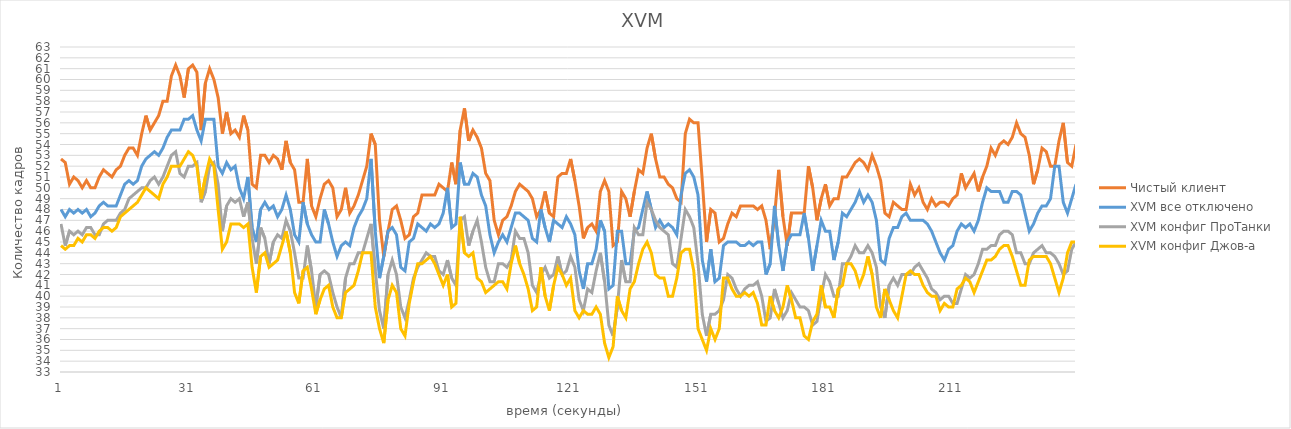
| Category | Чистый клиент | XVM все отключено | XVM конфиг ПроТанки | XVM конфиг Джов-а |
|---|---|---|---|---|
| 0 | 52.667 | 48 | 46.667 | 44.667 |
| 1 | 52.333 | 47.333 | 44.667 | 44.333 |
| 2 | 50.333 | 48 | 46 | 44.667 |
| 3 | 51 | 47.667 | 45.667 | 44.667 |
| 4 | 50.667 | 48 | 46 | 45.333 |
| 5 | 50 | 47.667 | 45.667 | 45 |
| 6 | 50.667 | 48 | 46.333 | 45.667 |
| 7 | 50 | 47.333 | 46.333 | 45.667 |
| 8 | 50 | 47.667 | 45.667 | 45.333 |
| 9 | 51 | 48.333 | 45.667 | 46 |
| 10 | 51.667 | 48.667 | 46.667 | 46.333 |
| 11 | 51.333 | 48.333 | 47 | 46.333 |
| 12 | 51 | 48.333 | 47 | 46 |
| 13 | 51.667 | 48.333 | 47 | 46.333 |
| 14 | 52 | 49.333 | 47.667 | 47.333 |
| 15 | 53 | 50.333 | 48 | 47.667 |
| 16 | 53.667 | 50.667 | 49 | 48 |
| 17 | 53.667 | 50.333 | 49.333 | 48.333 |
| 18 | 53 | 50.667 | 49.667 | 48.667 |
| 19 | 55 | 52 | 50 | 49.333 |
| 20 | 56.667 | 52.667 | 50 | 50 |
| 21 | 55.333 | 53 | 50.667 | 49.667 |
| 22 | 56 | 53.333 | 51 | 49.333 |
| 23 | 56.667 | 53 | 50.333 | 49 |
| 24 | 58 | 53.667 | 51 | 50.333 |
| 25 | 58 | 54.667 | 52 | 51 |
| 26 | 60.333 | 55.333 | 53 | 52 |
| 27 | 61.333 | 55.333 | 53.333 | 52 |
| 28 | 60.333 | 55.333 | 51.333 | 52 |
| 29 | 58.333 | 56.333 | 51 | 52.667 |
| 30 | 61 | 56.333 | 52 | 53.333 |
| 31 | 61.333 | 56.667 | 52 | 53 |
| 32 | 60.667 | 55.333 | 52.333 | 52 |
| 33 | 55.333 | 54.333 | 48.667 | 49 |
| 34 | 59.667 | 56.333 | 49.667 | 51 |
| 35 | 61 | 56.333 | 52 | 52.667 |
| 36 | 60 | 56.333 | 52.333 | 52 |
| 37 | 58.333 | 52 | 50.333 | 48 |
| 38 | 55 | 51.333 | 46 | 44.333 |
| 39 | 57 | 52.333 | 48.333 | 45 |
| 40 | 55 | 51.667 | 49 | 46.667 |
| 41 | 55.333 | 52 | 48.667 | 46.667 |
| 42 | 54.667 | 50 | 49 | 46.667 |
| 43 | 56.667 | 49 | 47.333 | 46.333 |
| 44 | 55.333 | 51 | 48.667 | 46.667 |
| 45 | 50.333 | 46.333 | 45.333 | 42.667 |
| 46 | 50 | 45 | 43 | 40.333 |
| 47 | 53 | 48 | 46.333 | 43.667 |
| 48 | 53 | 48.667 | 45.333 | 44 |
| 49 | 52.333 | 48 | 43 | 42.667 |
| 50 | 53 | 48.333 | 45 | 43 |
| 51 | 52.667 | 47.333 | 45.667 | 43.333 |
| 52 | 51.667 | 48 | 45.333 | 44.667 |
| 53 | 54.333 | 49.333 | 47 | 46 |
| 54 | 52.333 | 48 | 46 | 44 |
| 55 | 51.667 | 45.667 | 44 | 40.333 |
| 56 | 48.667 | 45 | 41.667 | 39.333 |
| 57 | 48.667 | 48.667 | 41.667 | 42.333 |
| 58 | 52.667 | 46.667 | 44.667 | 42.667 |
| 59 | 48.333 | 45.667 | 42.333 | 40.667 |
| 60 | 47.333 | 45 | 39 | 38.333 |
| 61 | 49 | 45 | 42 | 39.667 |
| 62 | 50.333 | 48 | 42.333 | 40.667 |
| 63 | 50.667 | 46.667 | 42 | 41 |
| 64 | 50 | 45 | 40.333 | 39 |
| 65 | 47.333 | 43.667 | 39 | 38 |
| 66 | 48 | 44.667 | 38 | 38 |
| 67 | 50 | 45 | 41.667 | 40.333 |
| 68 | 47.667 | 44.667 | 43 | 40.667 |
| 69 | 48.333 | 46.333 | 43 | 41 |
| 70 | 49.333 | 47.333 | 44 | 42.333 |
| 71 | 50.667 | 48 | 44 | 44 |
| 72 | 52 | 49 | 45.333 | 44 |
| 73 | 55 | 52.667 | 46.667 | 44 |
| 74 | 54 | 46 | 42.333 | 39 |
| 75 | 47 | 41.667 | 38.667 | 37 |
| 76 | 43.667 | 43.667 | 37 | 35.667 |
| 77 | 46 | 46 | 42 | 39.667 |
| 78 | 48 | 46.333 | 43.333 | 41 |
| 79 | 48.333 | 45.667 | 42 | 40.333 |
| 80 | 47 | 42.667 | 39 | 37 |
| 81 | 45.333 | 42.333 | 38 | 36.333 |
| 82 | 45.667 | 45 | 39.667 | 39.333 |
| 83 | 47.333 | 45.333 | 41.667 | 41.333 |
| 84 | 47.667 | 46.667 | 42.667 | 43 |
| 85 | 49.333 | 46.333 | 43.333 | 43 |
| 86 | 49.333 | 46 | 44 | 43.333 |
| 87 | 49.333 | 46.667 | 43.667 | 43.667 |
| 88 | 49.333 | 46.333 | 43.667 | 43 |
| 89 | 50.333 | 46.667 | 42.333 | 42 |
| 90 | 50 | 47.667 | 42 | 41 |
| 91 | 49.667 | 50 | 43.333 | 42 |
| 92 | 52.333 | 46.333 | 41.667 | 39 |
| 93 | 50.333 | 46.667 | 41 | 39.333 |
| 94 | 55.333 | 52.333 | 47 | 47.333 |
| 95 | 57.333 | 50.333 | 47.333 | 44 |
| 96 | 54.333 | 50.333 | 44.667 | 43.667 |
| 97 | 55.333 | 51.333 | 46 | 44 |
| 98 | 54.667 | 51 | 47 | 41.667 |
| 99 | 53.667 | 49.333 | 45 | 41.333 |
| 100 | 51.333 | 48.333 | 42.667 | 40.333 |
| 101 | 50.667 | 45.667 | 41.333 | 40.667 |
| 102 | 47 | 44 | 41.333 | 41 |
| 103 | 45.667 | 45 | 43 | 41.333 |
| 104 | 47 | 45.667 | 43 | 41.333 |
| 105 | 47.333 | 45 | 42.667 | 40.667 |
| 106 | 48.333 | 46.333 | 43.333 | 43 |
| 107 | 49.667 | 47.667 | 46 | 44.667 |
| 108 | 50.333 | 47.667 | 45.333 | 43 |
| 109 | 50 | 47.333 | 45.333 | 42 |
| 110 | 49.667 | 47 | 44 | 40.667 |
| 111 | 49 | 45.333 | 41 | 38.667 |
| 112 | 47.333 | 45 | 40.333 | 39 |
| 113 | 48 | 48 | 42 | 42.667 |
| 114 | 49.667 | 46.333 | 42.667 | 40 |
| 115 | 47.667 | 45 | 41.667 | 38.667 |
| 116 | 47.333 | 47 | 42 | 41 |
| 117 | 51 | 46.667 | 43.667 | 42.667 |
| 118 | 51.333 | 46.333 | 42 | 42 |
| 119 | 51.333 | 47.333 | 42.333 | 41 |
| 120 | 52.667 | 46.667 | 43.667 | 41.667 |
| 121 | 50.667 | 45.667 | 42.667 | 38.667 |
| 122 | 48.333 | 42.333 | 39.667 | 38 |
| 123 | 45.333 | 40.667 | 38.667 | 38.667 |
| 124 | 46.333 | 43 | 40.667 | 38.333 |
| 125 | 46.667 | 43 | 40.333 | 38.333 |
| 126 | 46 | 44.333 | 42.333 | 39 |
| 127 | 49.667 | 47 | 44 | 38.333 |
| 128 | 50.667 | 46 | 41.333 | 35.667 |
| 129 | 49.667 | 40.667 | 37.333 | 34.333 |
| 130 | 44.667 | 41 | 36.333 | 35.333 |
| 131 | 45 | 46 | 39 | 40 |
| 132 | 49.667 | 46 | 43.333 | 38.667 |
| 133 | 49 | 43 | 41.333 | 38 |
| 134 | 47.333 | 43 | 41.333 | 40.667 |
| 135 | 49.667 | 46 | 46.333 | 41.333 |
| 136 | 51.667 | 46.333 | 45.667 | 43 |
| 137 | 51.333 | 48 | 45.667 | 44.333 |
| 138 | 53.667 | 49.667 | 48.667 | 45 |
| 139 | 55 | 48 | 48 | 44 |
| 140 | 52.667 | 46.333 | 47 | 42 |
| 141 | 51 | 47 | 46.333 | 41.667 |
| 142 | 51 | 46.333 | 46 | 41.667 |
| 143 | 50.333 | 46.667 | 45.667 | 40 |
| 144 | 50 | 46.333 | 43 | 40 |
| 145 | 49 | 45.667 | 42.667 | 41.667 |
| 146 | 48.667 | 49.333 | 45.333 | 44 |
| 147 | 55 | 51.333 | 48 | 44.333 |
| 148 | 56.333 | 51.667 | 47.333 | 44.333 |
| 149 | 56 | 51 | 46.333 | 42.333 |
| 150 | 56 | 49.333 | 43 | 37 |
| 151 | 50.667 | 43.333 | 38.333 | 36 |
| 152 | 45 | 41.333 | 36.333 | 35 |
| 153 | 48 | 44.333 | 38.333 | 37 |
| 154 | 47.667 | 41.333 | 38.333 | 36 |
| 155 | 45 | 41.667 | 38.667 | 37 |
| 156 | 45.333 | 44.667 | 39.667 | 41.667 |
| 157 | 46.667 | 45 | 42 | 41.667 |
| 158 | 47.667 | 45 | 41.667 | 40.667 |
| 159 | 47.333 | 45 | 40.667 | 40 |
| 160 | 48.333 | 44.667 | 40 | 40 |
| 161 | 48.333 | 44.667 | 40.667 | 40.333 |
| 162 | 48.333 | 45 | 41 | 40 |
| 163 | 48.333 | 44.667 | 41 | 40.333 |
| 164 | 48 | 45 | 41.333 | 39.333 |
| 165 | 48.333 | 45 | 40 | 37.333 |
| 166 | 47 | 42 | 37.667 | 37.333 |
| 167 | 44.333 | 43 | 38 | 40 |
| 168 | 47.333 | 48.333 | 40.667 | 38.667 |
| 169 | 51.667 | 44.667 | 39.333 | 38 |
| 170 | 47.333 | 42.333 | 38 | 39 |
| 171 | 44.667 | 45 | 38.667 | 41 |
| 172 | 47.667 | 45.667 | 40.333 | 39.667 |
| 173 | 47.667 | 45.667 | 39.667 | 38 |
| 174 | 47.667 | 45.667 | 39 | 38 |
| 175 | 47.667 | 47.667 | 39 | 36.333 |
| 176 | 52 | 45.333 | 38.667 | 36 |
| 177 | 50 | 42.333 | 37.333 | 37.667 |
| 178 | 47 | 44.667 | 37.667 | 38.333 |
| 179 | 49 | 47 | 40 | 41 |
| 180 | 50.333 | 46 | 42 | 39 |
| 181 | 48.333 | 46 | 41.333 | 39 |
| 182 | 49 | 43.333 | 40 | 38 |
| 183 | 49 | 45 | 40 | 40.667 |
| 184 | 51 | 47.667 | 43 | 41 |
| 185 | 51 | 47.333 | 43 | 43 |
| 186 | 51.667 | 48 | 43.667 | 43 |
| 187 | 52.333 | 48.667 | 44.667 | 42.333 |
| 188 | 52.667 | 49.667 | 44 | 41 |
| 189 | 52.333 | 48.667 | 44 | 42 |
| 190 | 51.667 | 49.333 | 44.667 | 43.667 |
| 191 | 53 | 48.667 | 44 | 42 |
| 192 | 52 | 47 | 42.667 | 39 |
| 193 | 50.667 | 43.333 | 39 | 38 |
| 194 | 47.667 | 43 | 38 | 40.667 |
| 195 | 47.333 | 45.333 | 41 | 39.667 |
| 196 | 48.667 | 46.333 | 41.667 | 38.667 |
| 197 | 48.333 | 46.333 | 41 | 38 |
| 198 | 48 | 47.333 | 42 | 40 |
| 199 | 48 | 47.667 | 42 | 42 |
| 200 | 50.333 | 47 | 42 | 42.333 |
| 201 | 49.333 | 47 | 42.667 | 42 |
| 202 | 50 | 47 | 43 | 42 |
| 203 | 48.667 | 47 | 42.333 | 41 |
| 204 | 48 | 46.667 | 41.667 | 40.333 |
| 205 | 49 | 46 | 40.667 | 40 |
| 206 | 48.333 | 45 | 40.333 | 40 |
| 207 | 48.667 | 44 | 39.667 | 38.667 |
| 208 | 48.667 | 43.333 | 40 | 39.333 |
| 209 | 48.333 | 44.333 | 40 | 39 |
| 210 | 49 | 44.667 | 39.333 | 39 |
| 211 | 49.333 | 46 | 39.333 | 40.667 |
| 212 | 51.333 | 46.667 | 40.667 | 41 |
| 213 | 50 | 46.333 | 42 | 41.667 |
| 214 | 50.667 | 46.667 | 41.667 | 41.333 |
| 215 | 51.333 | 46 | 42 | 40.333 |
| 216 | 49.667 | 47 | 43 | 41.333 |
| 217 | 51 | 48.667 | 44.333 | 42.333 |
| 218 | 52 | 50 | 44.333 | 43.333 |
| 219 | 53.667 | 49.667 | 44.667 | 43.333 |
| 220 | 53 | 49.667 | 44.667 | 43.667 |
| 221 | 54 | 49.667 | 45.667 | 44.333 |
| 222 | 54.333 | 48.667 | 46 | 44.667 |
| 223 | 54 | 48.667 | 46 | 44.667 |
| 224 | 54.667 | 49.667 | 45.667 | 43.667 |
| 225 | 56 | 49.667 | 44 | 42.333 |
| 226 | 55 | 49.333 | 44 | 41 |
| 227 | 54.667 | 47.667 | 43 | 41 |
| 228 | 53 | 46 | 43 | 43.333 |
| 229 | 50.333 | 46.667 | 44 | 43.667 |
| 230 | 51.667 | 47.667 | 44.333 | 43.667 |
| 231 | 53.667 | 48.333 | 44.667 | 43.667 |
| 232 | 53.333 | 48.333 | 44 | 43.667 |
| 233 | 52 | 49 | 44 | 43 |
| 234 | 52 | 52 | 43.667 | 41.667 |
| 235 | 54.333 | 52 | 43 | 40.333 |
| 236 | 56 | 48.667 | 42 | 41.667 |
| 237 | 52.333 | 47.667 | 42.333 | 44 |
| 238 | 52 | 49 | 44.333 | 45 |
| 239 | 54 | 50.333 | 45 | 45 |